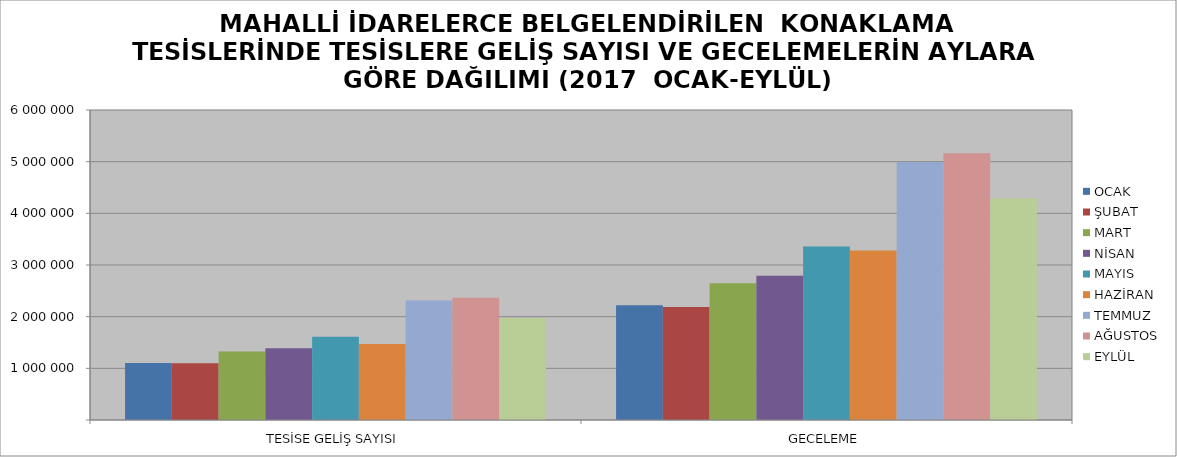
| Category | OCAK | ŞUBAT | MART | NİSAN | MAYIS | HAZİRAN | TEMMUZ | AĞUSTOS | EYLÜL |
|---|---|---|---|---|---|---|---|---|---|
| TESİSE GELİŞ SAYISI | 1104649 | 1099366 | 1327993 | 1389075 | 1611959 | 1472053 | 2311504 | 2364597 | 1973724 |
| GECELEME | 2222261 | 2187982 | 2645959 | 2791881 | 3355819 | 3280620 | 4994703 | 5161854 | 4292043 |